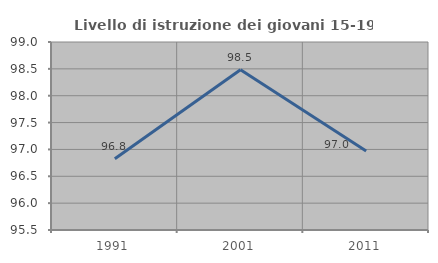
| Category | Livello di istruzione dei giovani 15-19 anni |
|---|---|
| 1991.0 | 96.825 |
| 2001.0 | 98.485 |
| 2011.0 | 96.97 |